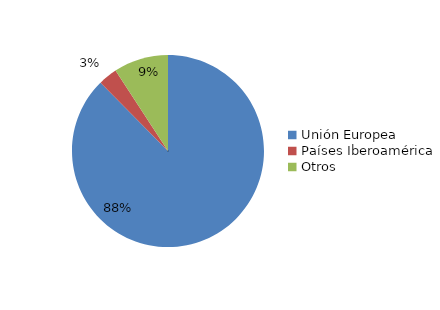
| Category | Series 0 |
|---|---|
| Unión Europea | 7291 |
| Países Iberoamérica | 266 |
| Otros | 766 |